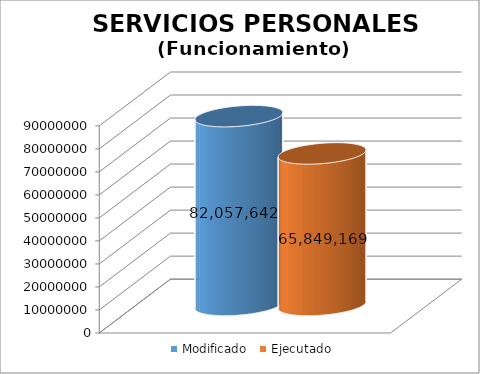
| Category | Modificado | Ejecutado |
|---|---|---|
| 0 | 82057642 | 65849168.61 |